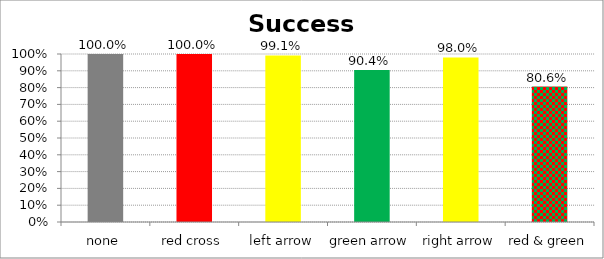
| Category | Success Rate |
|---|---|
| none | 1 |
| red cross | 1 |
| left arrow | 0.991 |
| green arrow | 0.904 |
| right arrow | 0.98 |
| red & green | 0.806 |